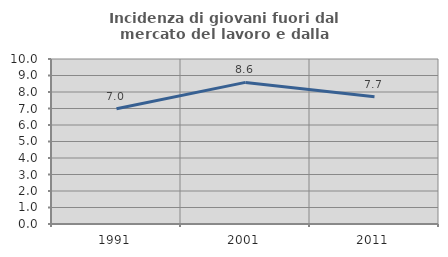
| Category | Incidenza di giovani fuori dal mercato del lavoro e dalla formazione  |
|---|---|
| 1991.0 | 6.98 |
| 2001.0 | 8.582 |
| 2011.0 | 7.715 |